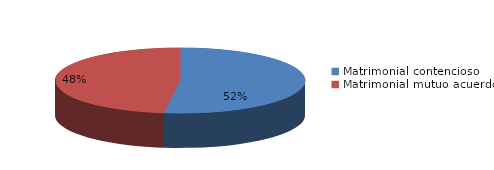
| Category | Series 0 |
|---|---|
| 0 | 129 |
| 1 | 119 |